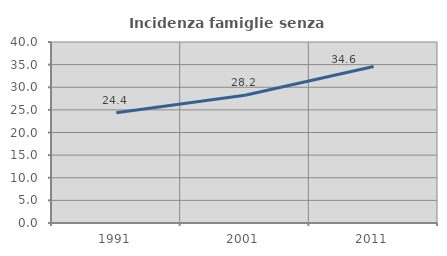
| Category | Incidenza famiglie senza nuclei |
|---|---|
| 1991.0 | 24.357 |
| 2001.0 | 28.218 |
| 2011.0 | 34.604 |